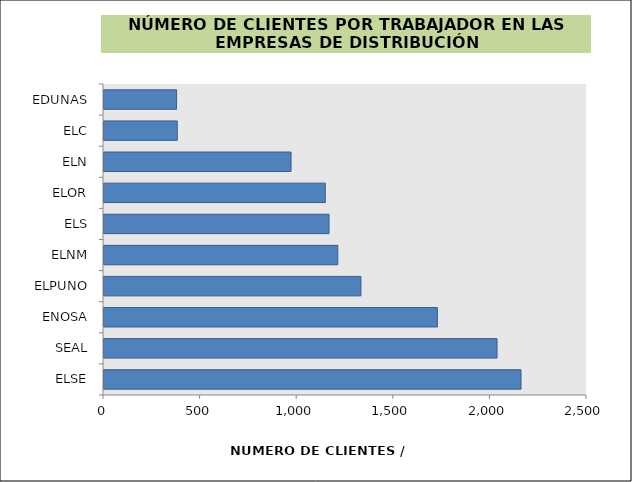
| Category | Series 0 |
|---|---|
| ELSE | 2158.454 |
| SEAL | 2034.372 |
| ENOSA | 1725.677 |
| ELPUNO | 1329.898 |
| ELNM | 1210.023 |
| ELS | 1164.728 |
| ELOR | 1145.426 |
| ELN | 968.202 |
| ELC | 379.183 |
| EDUNAS | 375.815 |